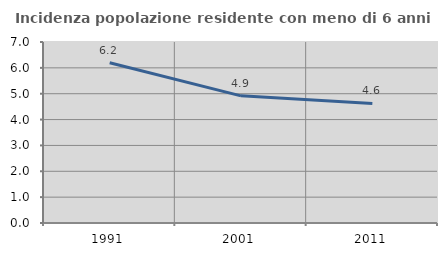
| Category | Incidenza popolazione residente con meno di 6 anni |
|---|---|
| 1991.0 | 6.196 |
| 2001.0 | 4.918 |
| 2011.0 | 4.623 |